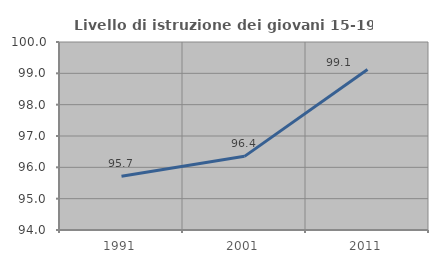
| Category | Livello di istruzione dei giovani 15-19 anni |
|---|---|
| 1991.0 | 95.714 |
| 2001.0 | 96.35 |
| 2011.0 | 99.123 |